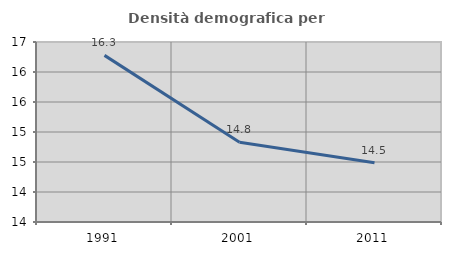
| Category | Densità demografica |
|---|---|
| 1991.0 | 16.277 |
| 2001.0 | 14.83 |
| 2011.0 | 14.487 |